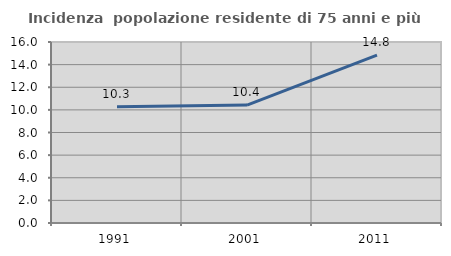
| Category | Incidenza  popolazione residente di 75 anni e più |
|---|---|
| 1991.0 | 10.284 |
| 2001.0 | 10.429 |
| 2011.0 | 14.831 |